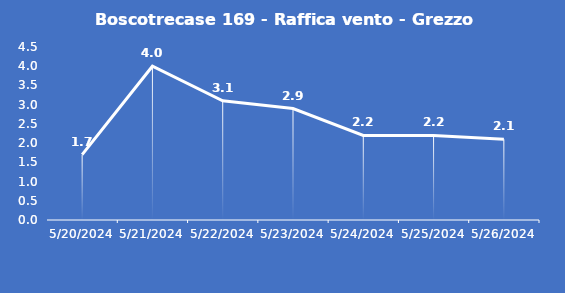
| Category | Boscotrecase 169 - Raffica vento - Grezzo (m/s) |
|---|---|
| 5/20/24 | 1.7 |
| 5/21/24 | 4 |
| 5/22/24 | 3.1 |
| 5/23/24 | 2.9 |
| 5/24/24 | 2.2 |
| 5/25/24 | 2.2 |
| 5/26/24 | 2.1 |